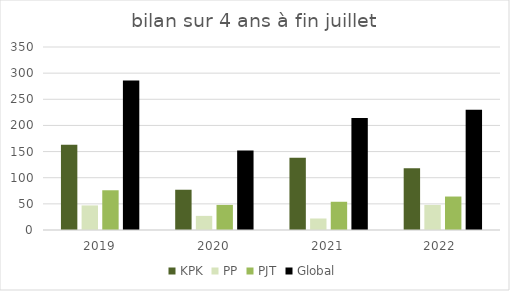
| Category | KPK | PP | PJT | Global |
|---|---|---|---|---|
| 2019 | 163 | 47 | 76 | 286 |
| 2020 | 77 | 27 | 48 | 152 |
| 2021 | 138 | 22 | 54 | 214 |
| 2022  | 118 | 48 | 64 | 230 |